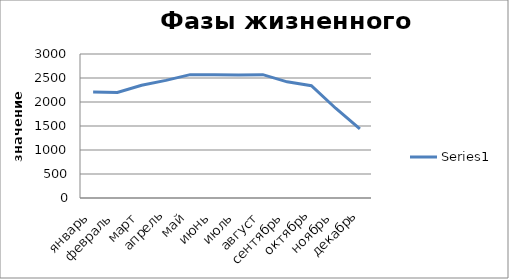
| Category | Series 0 |
|---|---|
| январь | 2210 |
| февраль | 2200 |
| март | 2350 |
| апрель | 2450 |
| май | 2570 |
| июнь | 2568 |
| июль | 2560 |
| август | 2570 |
| сентябрь | 2420 |
| октябрь | 2340 |
| ноябрь | 1870 |
| декабрь | 1440 |